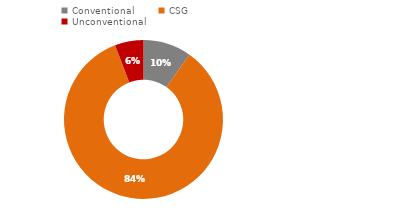
| Category | Resource Type |
|---|---|
| Conventional | 12508.21 |
| CSG | 107471.724 |
| Unconventional | 7413.7 |